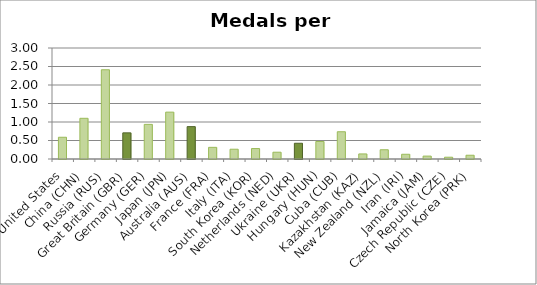
| Category | Per Participant |
|---|---|
|  United States | 0.588 |
|  China (CHN) | 1.1 |
|  Russia (RUS) | 2.412 |
|  Great Britain (GBR) | 0.707 |
|  Germany (GER) | 0.936 |
|  Japan (JPN) | 1.267 |
|  Australia (AUS) | 0.875 |
|  France (FRA) | 0.315 |
|  Italy (ITA) | 0.264 |
|  South Korea (KOR) | 0.283 |
|  Netherlands (NED) | 0.183 |
|  Ukraine (UKR) | 0.426 |
|  Hungary (HUN) | 0.474 |
|  Cuba (CUB) | 0.737 |
|  Kazakhstan (KAZ) | 0.137 |
|  New Zealand (NZL) | 0.25 |
|  Iran (IRI) | 0.128 |
|  Jamaica (JAM) | 0.078 |
|  Czech Republic (CZE) | 0.049 |
|  North Korea (PRK) | 0.102 |